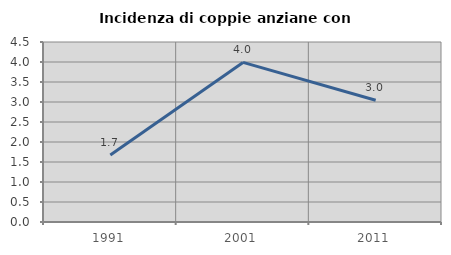
| Category | Incidenza di coppie anziane con figli |
|---|---|
| 1991.0 | 1.675 |
| 2001.0 | 3.99 |
| 2011.0 | 3.042 |